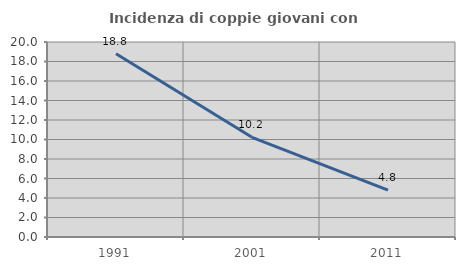
| Category | Incidenza di coppie giovani con figli |
|---|---|
| 1991.0 | 18.789 |
| 2001.0 | 10.224 |
| 2011.0 | 4.815 |